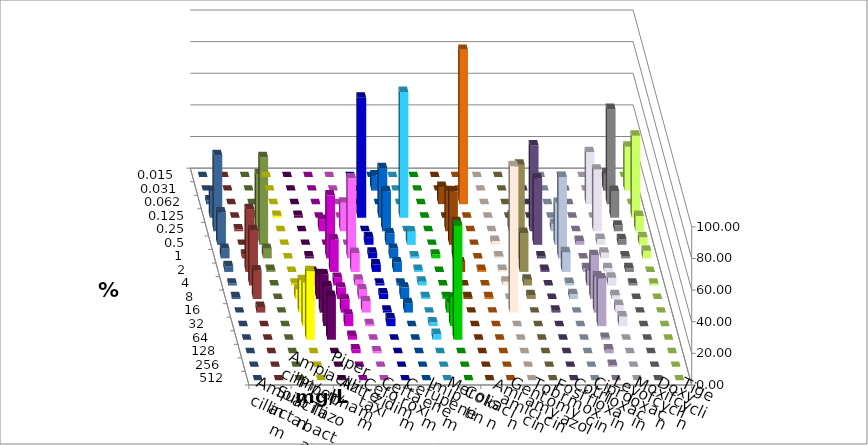
| Category | Ampicillin | Ampicillin/ Sulbactam | Piperacillin | Piperacillin/ Tazobactam | Aztreonam | Cefotaxim | Ceftazidim | Cefuroxim | Imipenem | Meropenem | Colistin | Amikacin | Gentamicin | Tobramycin | Fosfomycin | Cotrimoxazol | Ciprofloxacin | Levofloxacin | Moxifloxacin | Doxycyclin | Tigecyclin |
|---|---|---|---|---|---|---|---|---|---|---|---|---|---|---|---|---|---|---|---|---|---|
| 0.015 | 0 | 0 | 0 | 0 | 0 | 0 | 0 | 0 | 0 | 0 | 0 | 0 | 0 | 0 | 0 | 0 | 0 | 0 | 0 | 0 | 0 |
| 0.031 | 0 | 0 | 0 | 0 | 0 | 9.639 | 0 | 0 | 0 | 0 | 0 | 0 | 0 | 0 | 0 | 0 | 10.843 | 27.711 | 0 | 0 | 0 |
| 0.062 | 0 | 0 | 0 | 0 | 0 | 0 | 0 | 0 | 10.843 | 97.59 | 0 | 0 | 0 | 0 | 0 | 32.927 | 60.241 | 0 | 2.41 | 0 | 0 |
| 0.125 | 1.205 | 1.205 | 0 | 0 | 75.904 | 31.325 | 79.518 | 0 | 0 | 0 | 0 | 0 | 0 | 0 | 0 | 0 | 16.867 | 51.807 | 16.867 | 0 | 1.205 |
| 0.25 | 0 | 0 | 7.229 | 18.072 | 0 | 25.301 | 0 | 0 | 25.301 | 0 | 0 | 9.877 | 54.321 | 4.688 | 0 | 39.024 | 3.614 | 9.639 | 48.193 | 1.205 | 36.145 |
| 0.5 | 0 | 0 | 0 | 0 | 4.819 | 7.229 | 8.434 | 0 | 33.735 | 0 | 2.469 | 0 | 41.975 | 26.562 | 2.41 | 3.659 | 3.614 | 4.819 | 20.482 | 0 | 55.422 |
| 1.0 | 0 | 1.205 | 39.759 | 50.602 | 3.614 | 6.024 | 1.205 | 2.41 | 22.892 | 0 | 1.235 | 59.259 | 1.235 | 51.562 | 0 | 3.659 | 1.205 | 4.819 | 6.024 | 2.41 | 6.024 |
| 2.0 | 0 | 0 | 20.482 | 12.048 | 4.819 | 6.024 | 1.205 | 0 | 6.024 | 1.205 | 1.235 | 24.691 | 1.235 | 12.5 | 2.41 | 2.439 | 2.41 | 0 | 3.614 | 39.759 | 1.205 |
| 4.0 | 1.205 | 4.819 | 4.819 | 3.614 | 1.205 | 1.205 | 2.41 | 0 | 0 | 0 | 2.469 | 3.704 | 0 | 1.562 | 9.639 | 4.878 | 1.205 | 1.205 | 1.205 | 34.94 | 0 |
| 8.0 | 6.024 | 15.663 | 7.229 | 6.024 | 3.614 | 7.229 | 1.205 | 1.205 | 1.205 | 1.205 | 0 | 2.469 | 0 | 3.125 | 27.711 | 2.439 | 0 | 0 | 1.205 | 18.072 | 0 |
| 16.0 | 20.482 | 24.096 | 8.434 | 7.229 | 1.205 | 6.024 | 0 | 6.024 | 0 | 0 | 92.593 | 0 | 1.235 | 0 | 22.892 | 4.878 | 0 | 0 | 0 | 3.614 | 0 |
| 32.0 | 27.711 | 25.301 | 7.229 | 1.205 | 4.819 | 0 | 2.41 | 18.072 | 0 | 0 | 0 | 0 | 0 | 0 | 30.12 | 6.098 | 0 | 0 | 0 | 0 | 0 |
| 64.0 | 43.373 | 27.711 | 2.41 | 0 | 0 | 0 | 3.614 | 72.289 | 0 | 0 | 0 | 0 | 0 | 0 | 1.205 | 0 | 0 | 0 | 0 | 0 | 0 |
| 128.0 | 0 | 0 | 2.41 | 1.205 | 0 | 0 | 0 | 0 | 0 | 0 | 0 | 0 | 0 | 0 | 2.41 | 0 | 0 | 0 | 0 | 0 | 0 |
| 256.0 | 0 | 0 | 0 | 0 | 0 | 0 | 0 | 0 | 0 | 0 | 0 | 0 | 0 | 0 | 1.205 | 0 | 0 | 0 | 0 | 0 | 0 |
| 512.0 | 0 | 0 | 0 | 0 | 0 | 0 | 0 | 0 | 0 | 0 | 0 | 0 | 0 | 0 | 0 | 0 | 0 | 0 | 0 | 0 | 0 |